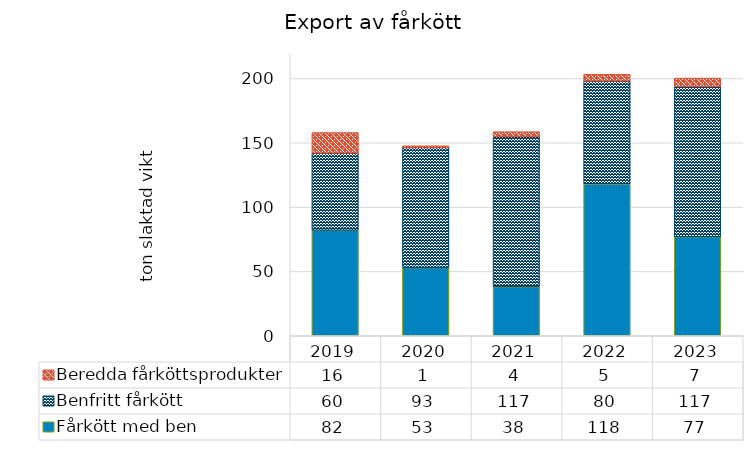
| Category | Fårkött med ben | Benfritt fårkött | Beredda fårköttsprodukter |
|---|---|---|---|
| 2019 | 82 | 60 | 16 |
| 2020 | 53 | 93.333 | 1.333 |
| 2021 | 38 | 116.667 | 4 |
| 2022 | 118 | 80 | 5.3 |
| 2023 | 77 | 116.667 | 6.667 |